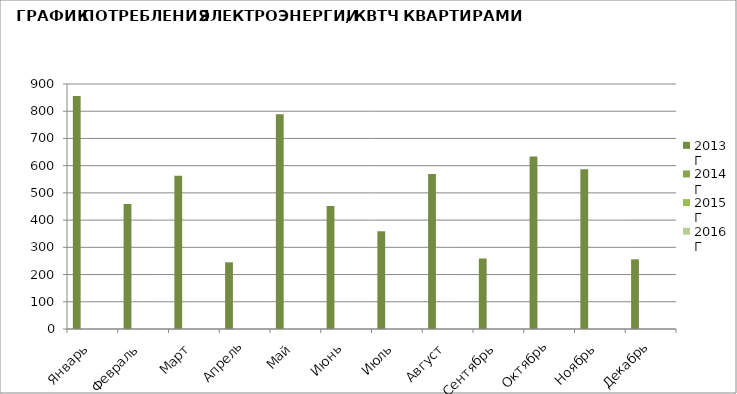
| Category | 2013 Г | 2014 Г | 2015 Г | 2016 Г | 2017 Г |
|---|---|---|---|---|---|
| Январь  | 856 |  |  |  |  |
| Февраль  | 459 |  |  |  |  |
| Март | 563 |  |  |  |  |
| Апрель | 245 |  |  |  |  |
| Май | 789 |  |  |  |  |
| Июнь | 452 |  |  |  |  |
| Июль | 359 |  |  |  |  |
| Август | 569 |  |  |  |  |
| Сентябрь | 259 |  |  |  |  |
| Октябрь | 634 |  |  |  |  |
| Ноябрь | 587 |  |  |  |  |
| Декабрь | 256 |  |  |  |  |